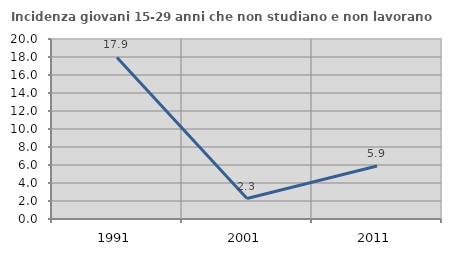
| Category | Incidenza giovani 15-29 anni che non studiano e non lavorano  |
|---|---|
| 1991.0 | 17.949 |
| 2001.0 | 2.273 |
| 2011.0 | 5.882 |